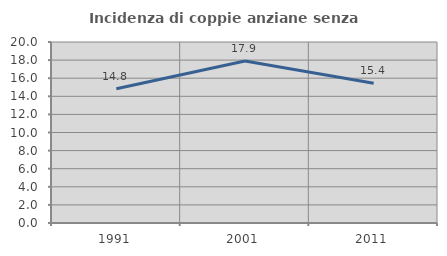
| Category | Incidenza di coppie anziane senza figli  |
|---|---|
| 1991.0 | 14.826 |
| 2001.0 | 17.896 |
| 2011.0 | 15.434 |